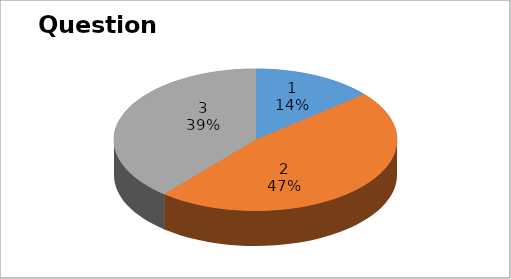
| Category | Series 0 |
|---|---|
| 0 | 5 |
| 1 | 17 |
| 2 | 14 |